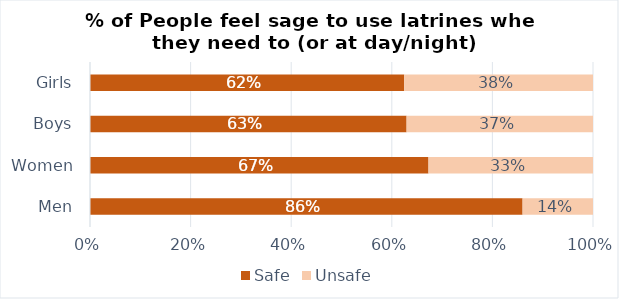
| Category | Safe | Unsafe |
|---|---|---|
| Men | 0.86 | 0.14 |
| Women | 0.673 | 0.327 |
| Boys | 0.629 | 0.371 |
| Girls | 0.625 | 0.375 |